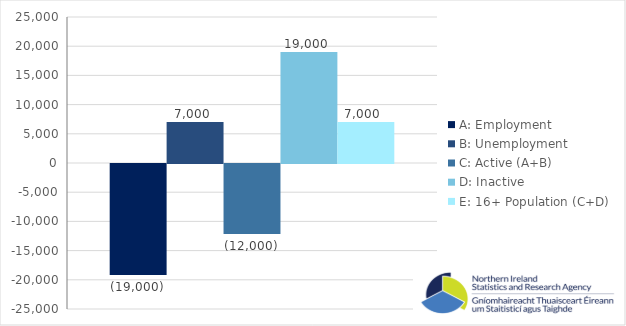
| Category | A: Employment | B: Unemployment | C: Active (A+B) | D: Inactive | E: 16+ Population (C+D) |
|---|---|---|---|---|---|
| 0 | -19000 | 7000 | -12000 | 19000 | 7000 |